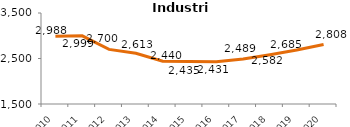
| Category | Industria |
|---|---|
| 2010.0 | 2988.4 |
| 2011.0 | 2999.1 |
| 2012.0 | 2700.4 |
| 2013.0 | 2613.4 |
| 2014.0 | 2439.8 |
| 2015.0 | 2435 |
| 2016.0 | 2431.3 |
| 2017.0 | 2489.4 |
| 2018.0 | 2582.4 |
| 2019.0 | 2685.4 |
| 2020.0 | 2808.2 |